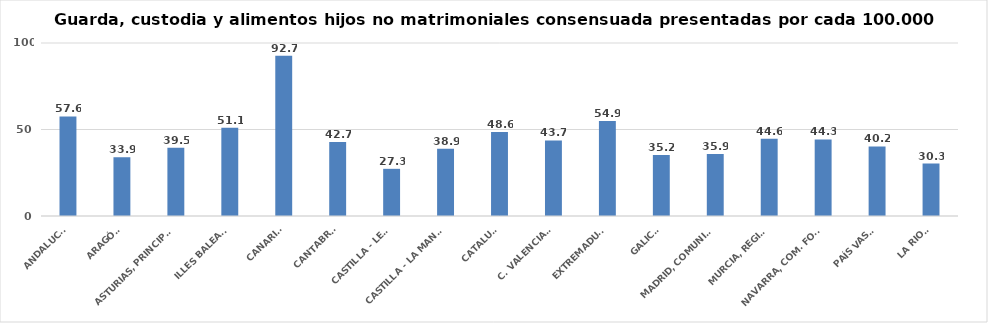
| Category | Series 0 |
|---|---|
| ANDALUCÍA | 57.565 |
| ARAGÓN | 33.929 |
| ASTURIAS, PRINCIPADO | 39.515 |
| ILLES BALEARS | 51.077 |
| CANARIAS | 92.667 |
| CANTABRIA | 42.706 |
| CASTILLA - LEÓN | 27.269 |
| CASTILLA - LA MANCHA | 38.912 |
| CATALUÑA | 48.623 |
| C. VALENCIANA | 43.704 |
| EXTREMADURA | 54.893 |
| GALICIA | 35.236 |
| MADRID, COMUNIDAD | 35.895 |
| MURCIA, REGIÓN | 44.586 |
| NAVARRA, COM. FORAL | 44.269 |
| PAÍS VASCO | 40.214 |
| LA RIOJA | 30.323 |